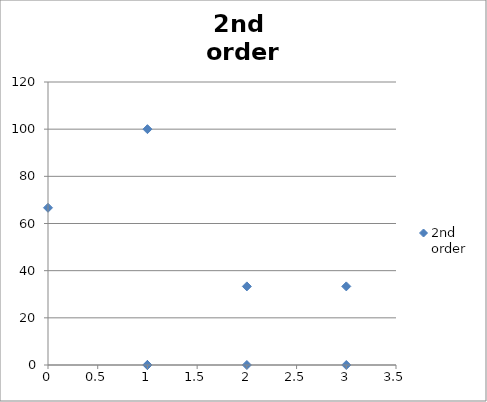
| Category | 2nd 
order |
|---|---|
| 3.0 | 33.33 |
| 1.0 | 0 |
| 0.0 | 66.67 |
| 1.0 | 0 |
| 2.0 | 33.33 |
| 3.0 | 0 |
| 1.0 | 0 |
| 1.0 | 100 |
| 2.0 | 0 |
| 1.0 | 0 |